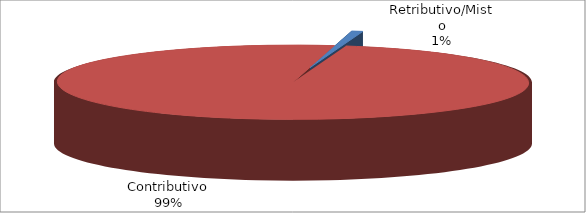
| Category | Series 1 |
|---|---|
| Retributivo/Misto | 156 |
| Contributivo | 20183 |